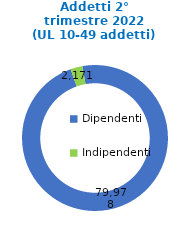
| Category | Series 0 |
|---|---|
| Dipendenti | 79978 |
| Indipendenti | 2171 |